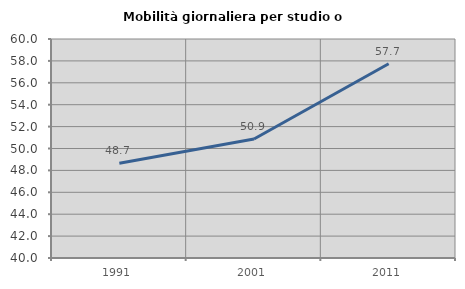
| Category | Mobilità giornaliera per studio o lavoro |
|---|---|
| 1991.0 | 48.659 |
| 2001.0 | 50.865 |
| 2011.0 | 57.742 |